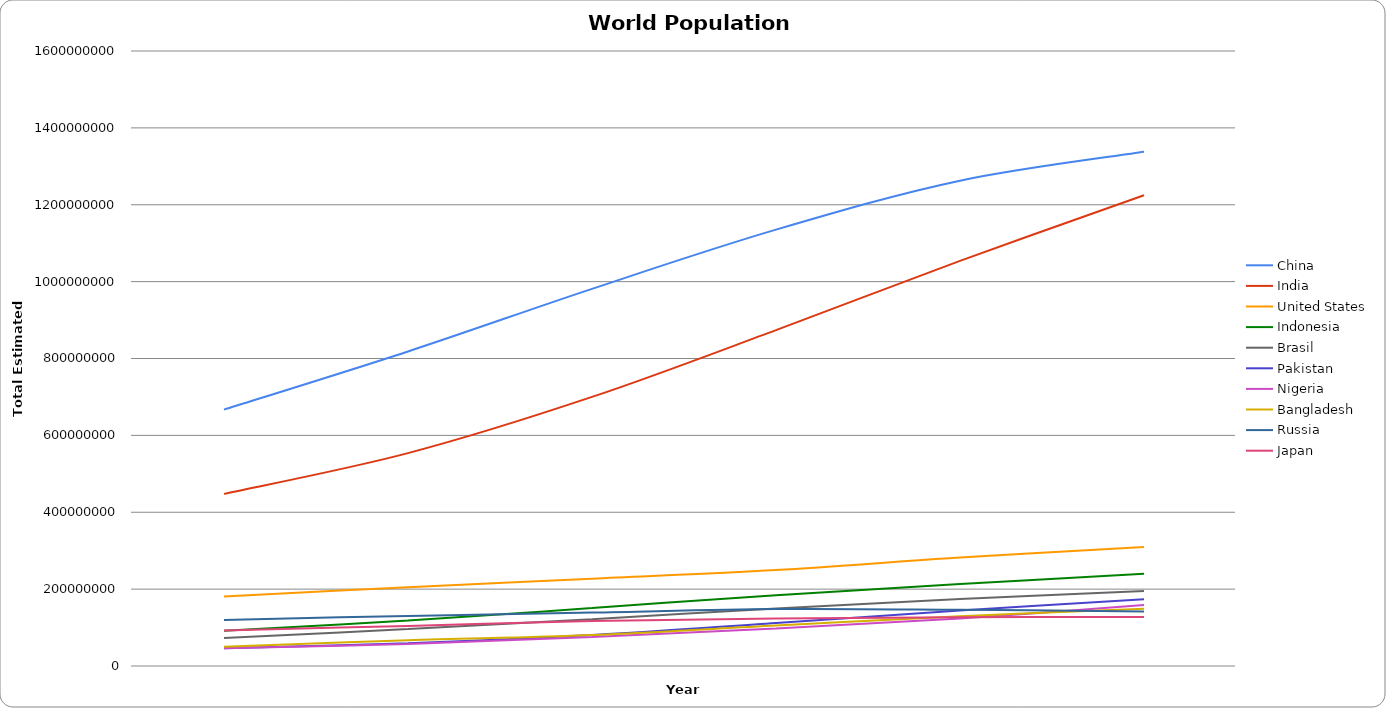
| Category | China | India | United States | Indonesia | Brasil | Pakistan | Nigeria | Bangladesh | Russia | Japan |
|---|---|---|---|---|---|---|---|---|---|---|
| 1960.0 | 667070000 | 447844200 | 180671000 | 91946600 | 72758800 | 45920200 | 45926300 | 50101900 | 119897000 | 92500600 |
| 1970.0 | 818315000 | 553873900 | 205052000 | 118361700 | 96078300 | 59382700 | 57357300 | 66881200 | 130404000 | 104345000 |
| 1980.0 | 981235000 | 700058600 | 227225000 | 150820000 | 121711900 | 80492700 | 75543400 | 80624400 | 139010000 | 116782000 |
| 1990.0 | 1135200000 | 873785400 | 249623000 | 184345900 | 149650200 | 111844700 | 97552100 | 105256000 | 148292000 | 123537000 |
| 2000.0 | 1262600000 | 1053900000 | 282162400 | 213394400 | 174425400 | 144522200 | 123688500 | 129592300 | 146303000 | 126870000 |
| 2010.0 | 1337800000 | 1224600000 | 309349000 | 239870900 | 194946500 | 173593400 | 158423200 | 148692100 | 141920000 | 127450500 |